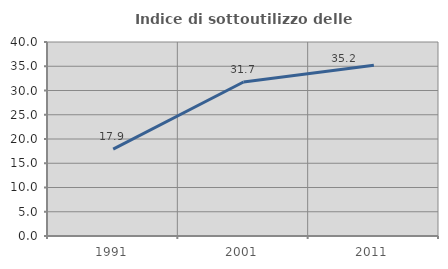
| Category | Indice di sottoutilizzo delle abitazioni  |
|---|---|
| 1991.0 | 17.91 |
| 2001.0 | 31.746 |
| 2011.0 | 35.211 |